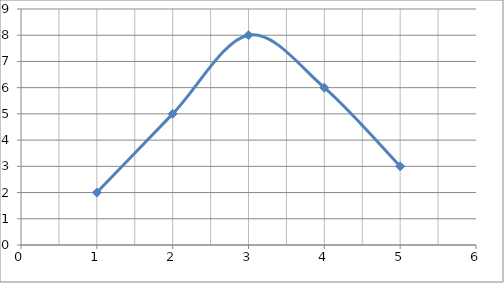
| Category | Series 0 |
|---|---|
| 1.0 | 2 |
| 2.0 | 5 |
| 3.0 | 8 |
| 4.0 | 6 |
| 5.0 | 3 |